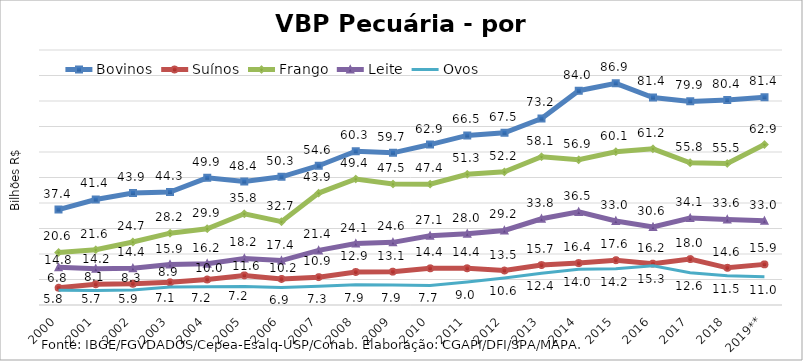
| Category | Bovinos | Suínos | Frango | Leite | Ovos |
|---|---|---|---|---|---|
| 2000 | 37.432 | 6.778 | 20.597 | 14.785 | 5.781 |
| 2001 | 41.378 | 8.131 | 21.649 | 14.228 | 5.697 |
| 2002 | 43.91 | 8.334 | 24.712 | 14.407 | 5.869 |
| 2003 | 44.317 | 8.907 | 28.174 | 15.865 | 7.099 |
| 2004 | 49.861 | 10.014 | 29.917 | 16.215 | 7.195 |
| 2005 | 48.408 | 11.61 | 35.767 | 18.237 | 7.244 |
| 2006 | 50.26 | 10.213 | 32.675 | 17.419 | 6.881 |
| 2007 | 54.621 | 10.921 | 43.902 | 21.415 | 7.313 |
| 2008 | 60.308 | 12.932 | 49.42 | 24.09 | 7.898 |
| 2009 | 59.679 | 13.072 | 47.45 | 24.56 | 7.875 |
| 2010 | 62.919 | 14.38 | 47.393 | 27.123 | 7.66 |
| 2011 | 66.515 | 14.403 | 51.258 | 27.961 | 9.026 |
| 2012 | 67.507 | 13.524 | 52.214 | 29.218 | 10.58 |
| 2013 | 73.154 | 15.658 | 58.115 | 33.811 | 12.444 |
| 2014 | 84.04 | 16.446 | 56.94 | 36.511 | 13.981 |
| 2015 | 86.932 | 17.576 | 60.111 | 32.958 | 14.235 |
| 2016 | 81.373 | 16.22 | 61.248 | 30.581 | 15.347 |
| 2017 | 79.853 | 18.006 | 55.787 | 34.074 | 12.65 |
| 2018 | 80.389 | 14.582 | 55.483 | 33.567 | 11.503 |
| 2019** | 81.427 | 15.931 | 62.927 | 33.028 | 11.043 |